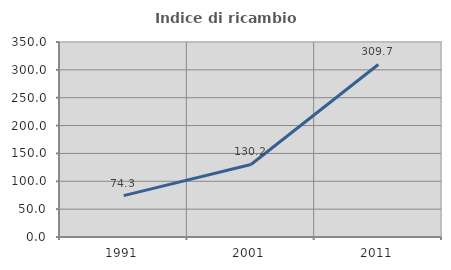
| Category | Indice di ricambio occupazionale  |
|---|---|
| 1991.0 | 74.302 |
| 2001.0 | 130.207 |
| 2011.0 | 309.667 |